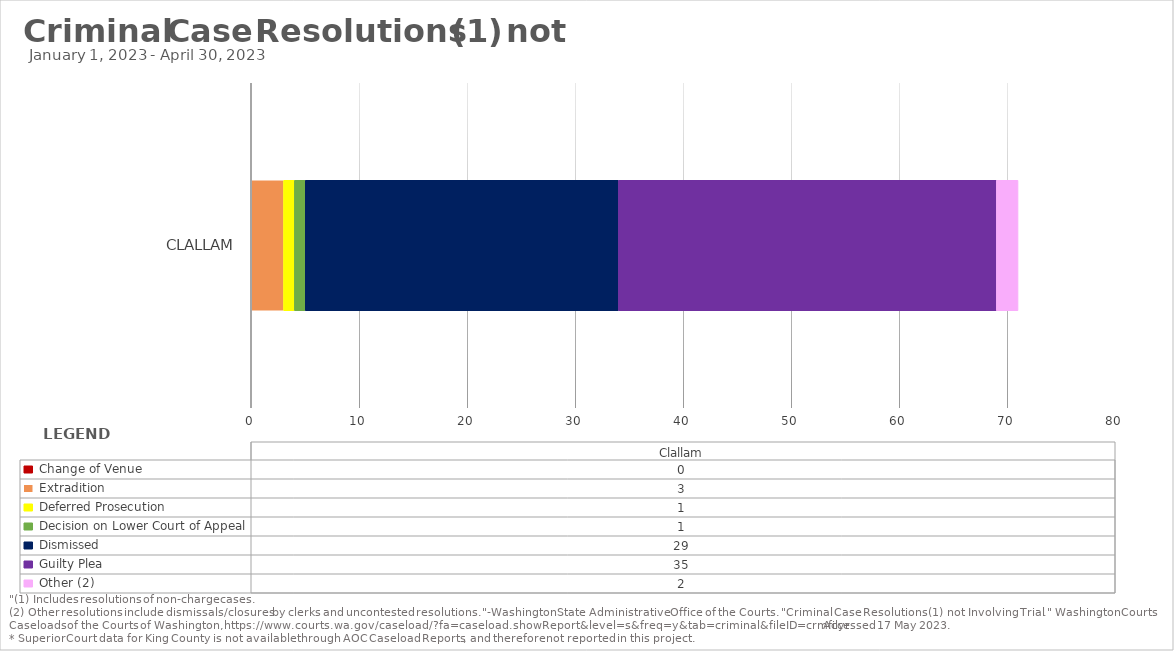
| Category |  Change of Venue  |  Extradition  |  Deferred Prosecution  |  Decision on Lower Court of Appeal  |  Dismissed  |  Guilty Plea  |  Other (2)  |
|---|---|---|---|---|---|---|---|
| Clallam | 0 | 3 | 1 | 1 | 29 | 35 | 2 |